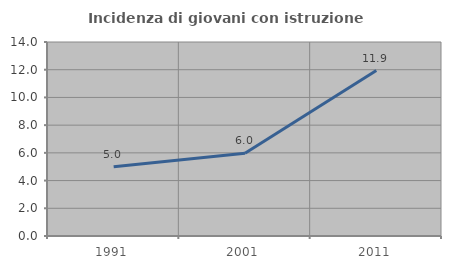
| Category | Incidenza di giovani con istruzione universitaria |
|---|---|
| 1991.0 | 5 |
| 2001.0 | 5.978 |
| 2011.0 | 11.94 |